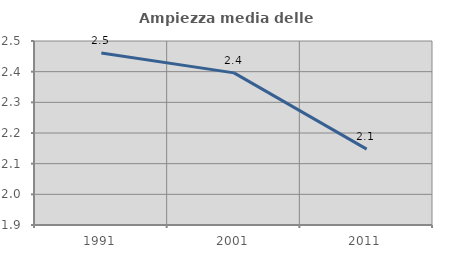
| Category | Ampiezza media delle famiglie |
|---|---|
| 1991.0 | 2.461 |
| 2001.0 | 2.396 |
| 2011.0 | 2.148 |